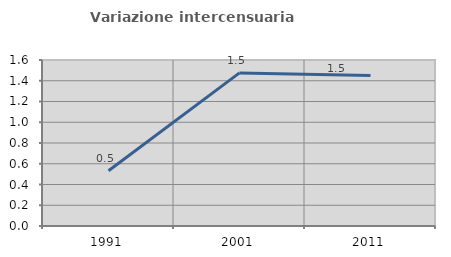
| Category | Variazione intercensuaria annua |
|---|---|
| 1991.0 | 0.533 |
| 2001.0 | 1.476 |
| 2011.0 | 1.45 |